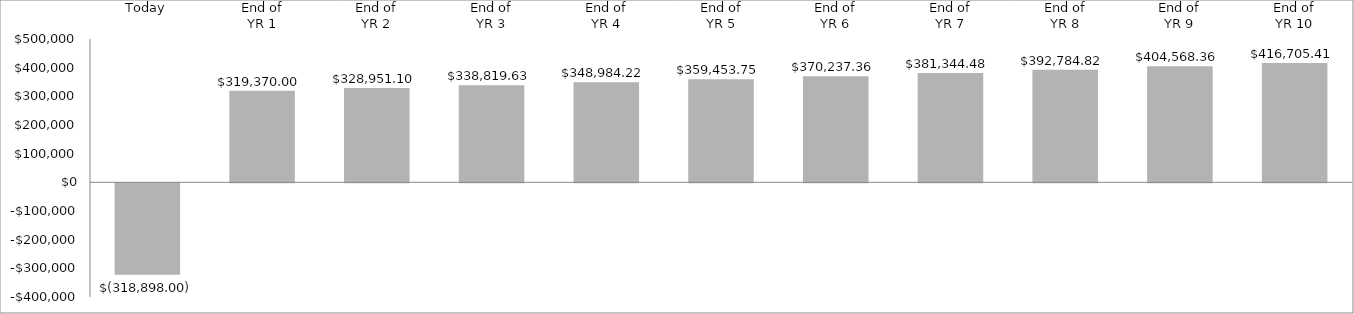
| Category | Annual Cash Flow |
|---|---|
| Today | -318898 |
| End of_x000d_YR 1 | 319370 |
| End of_x000d_YR 2 | 328951.1 |
| End of_x000d_YR 3 | 338819.633 |
| End of_x000d_YR 4 | 348984.222 |
| End of_x000d_YR 5 | 359453.749 |
| End of_x000d_YR 6 | 370237.361 |
| End of_x000d_YR 7 | 381344.482 |
| End of_x000d_YR 8 | 392784.816 |
| End of_x000d_YR 9 | 404568.361 |
| End of_x000d_YR 10 | 416705.412 |